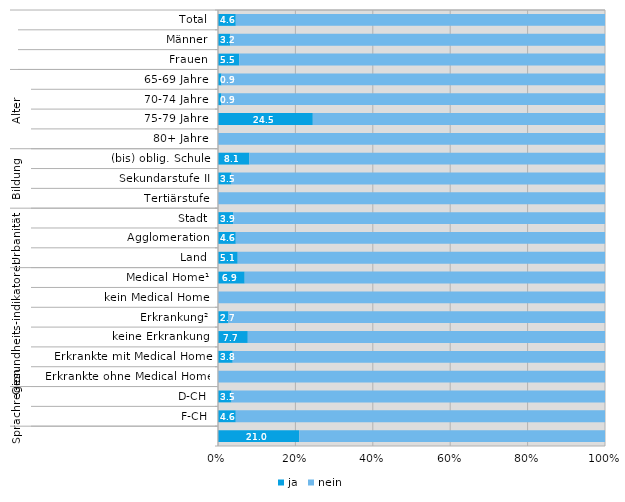
| Category | ja | nein |
|---|---|---|
| 0 | 4.6 | 95.4 |
| 1 | 3.2 | 96.8 |
| 2 | 5.5 | 94.5 |
| 3 | 0.9 | 99.1 |
| 4 | 0.9 | 99.1 |
| 5 | 24.5 | 75.5 |
| 6 | 0 | 100 |
| 7 | 8.1 | 91.9 |
| 8 | 3.5 | 96.5 |
| 9 | 0 | 100 |
| 10 | 3.9 | 96.1 |
| 11 | 4.6 | 95.4 |
| 12 | 5.1 | 94.9 |
| 13 | 6.9 | 93.1 |
| 14 | 0 | 100 |
| 15 | 2.7 | 97.3 |
| 16 | 7.7 | 92.3 |
| 17 | 3.8 | 96.2 |
| 18 | 0 | 100 |
| 19 | 3.5 | 96.5 |
| 20 | 4.6 | 95.4 |
| 21 | 21 | 79 |